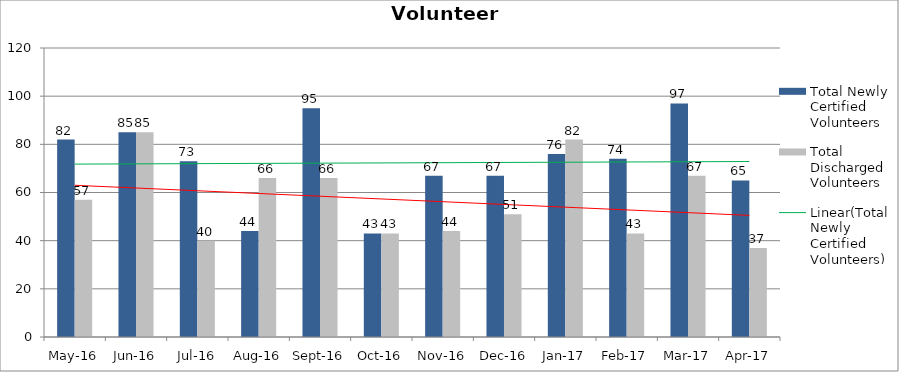
| Category | Total Newly Certified Volunteers | Total Discharged Volunteers |
|---|---|---|
| May-16 | 82 | 57 |
| Jun-16 | 85 | 85 |
| Jul-16 | 73 | 40 |
| Aug-16 | 44 | 66 |
| Sep-16 | 95 | 66 |
| Oct-16 | 43 | 43 |
| Nov-16 | 67 | 44 |
| Dec-16 | 67 | 51 |
| Jan-17 | 76 | 82 |
| Feb-17 | 74 | 43 |
| Mar-17 | 97 | 67 |
| Apr-17 | 65 | 37 |